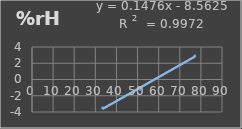
| Category | Humedad |
|---|---|
| 33.5 | -3.5 |
| 51.2 | -1.2 |
| 77.1 | 2.9 |